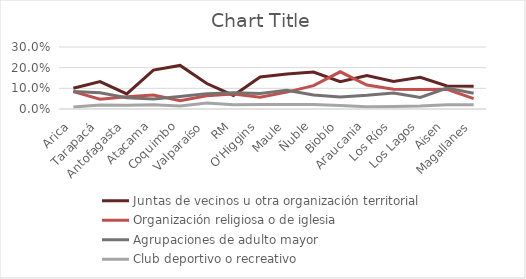
| Category | Juntas de vecinos u otra organización territorial | Organización religiosa o de iglesia | Agrupaciones de adulto mayor | Club deportivo o recreativo |
|---|---|---|---|---|
| Arica | 0.101 | 0.084 | 0.084 | 0.01 |
| Tarapacá | 0.132 | 0.048 | 0.078 | 0.02 |
| Antofagasta | 0.073 | 0.059 | 0.055 | 0.019 |
| Atacama | 0.188 | 0.068 | 0.048 | 0.02 |
| Coquimbo | 0.211 | 0.04 | 0.061 | 0.014 |
| Valparaíso | 0.123 | 0.064 | 0.074 | 0.029 |
| RM | 0.066 | 0.073 | 0.079 | 0.021 |
| O'Higgins | 0.155 | 0.057 | 0.075 | 0.022 |
| Maule | 0.169 | 0.082 | 0.091 | 0.022 |
| Ñuble | 0.179 | 0.113 | 0.068 | 0.021 |
| Biobío | 0.132 | 0.18 | 0.058 | 0.017 |
| Araucania | 0.162 | 0.116 | 0.066 | 0.011 |
| Los Ríos | 0.133 | 0.095 | 0.078 | 0.012 |
| Los Lagos | 0.153 | 0.094 | 0.056 | 0.014 |
| Aisen | 0.112 | 0.095 | 0.101 | 0.02 |
| Magallanes | 0.11 | 0.05 | 0.076 | 0.021 |